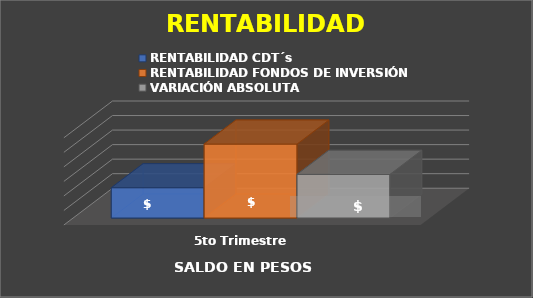
| Category | RENTABILIDAD CDT´s | RENTABILIDAD FONDOS DE INVERSIÓN | VARIACIÓN ABSOLUTA |
|---|---|---|---|
| 5to Trimestre | 10423813.077 | 25439321.798 | 15015508.72 |